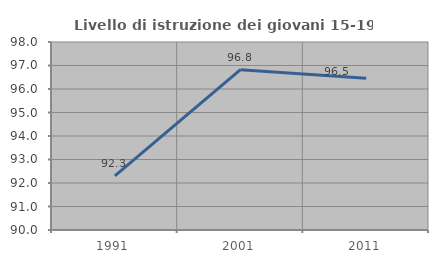
| Category | Livello di istruzione dei giovani 15-19 anni |
|---|---|
| 1991.0 | 92.299 |
| 2001.0 | 96.822 |
| 2011.0 | 96.455 |